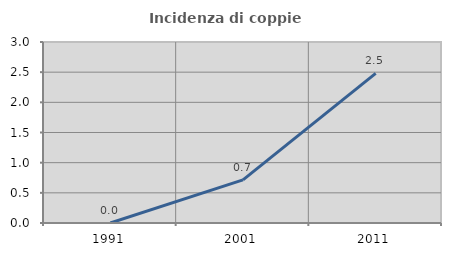
| Category | Incidenza di coppie miste |
|---|---|
| 1991.0 | 0 |
| 2001.0 | 0.714 |
| 2011.0 | 2.479 |